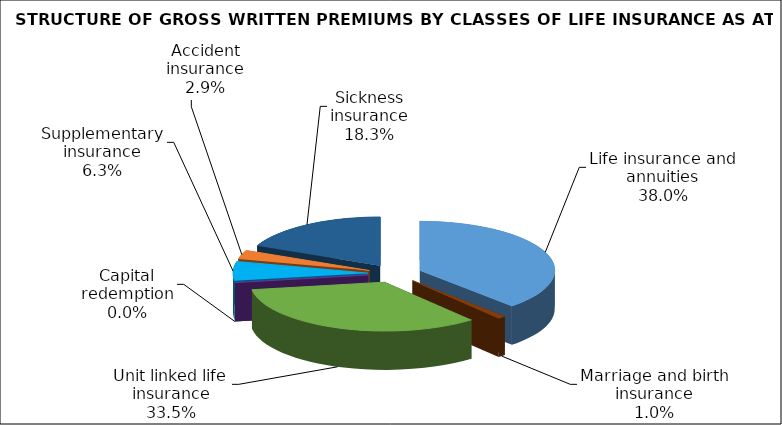
| Category | Series 0 |
|---|---|
| Life insurance and annuities | 138343520.057 |
| Marriage and birth insurance | 3480935.159 |
| Unit linked life insurance | 121942382.831 |
| Capital redemption | 0 |
| Supplementary insurance | 22966475.234 |
| Accident insurance | 10610371.52 |
| Sickness insurance | 66409823 |